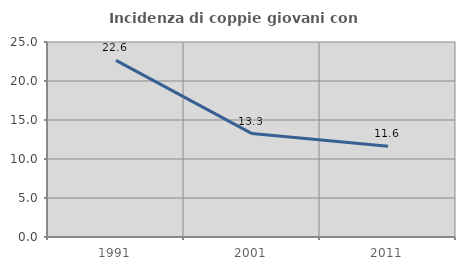
| Category | Incidenza di coppie giovani con figli |
|---|---|
| 1991.0 | 22.65 |
| 2001.0 | 13.256 |
| 2011.0 | 11.647 |